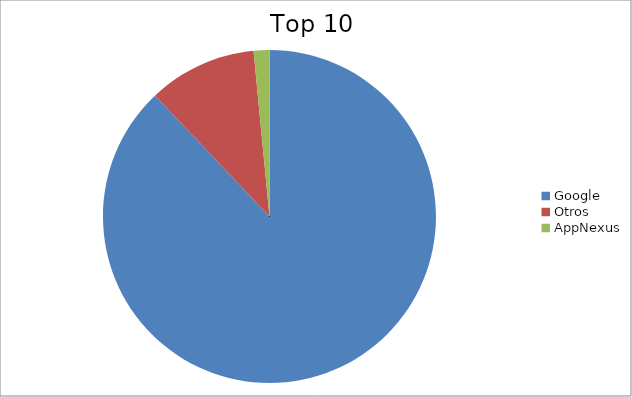
| Category | Series 0 |
|---|---|
| Google | 87.93 |
| Otros | 10.54 |
| AppNexus | 1.53 |